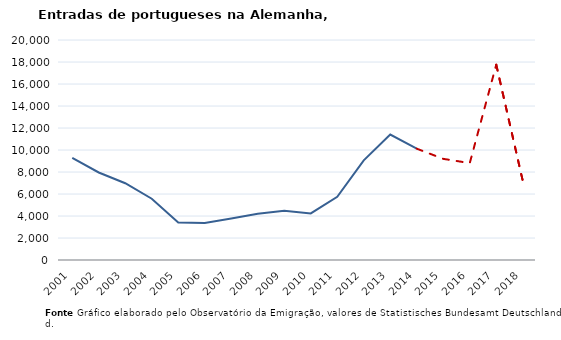
| Category | Entradas |
|---|---|
| 2001.0 | 9287 |
| 2002.0 | 7955 |
| 2003.0 | 6981 |
| 2004.0 | 5570 |
| 2005.0 | 3418 |
| 2006.0 | 3371 |
| 2007.0 | 3766 |
| 2008.0 | 4214 |
| 2009.0 | 4468 |
| 2010.0 | 4238 |
| 2011.0 | 5752 |
| 2012.0 | 9054 |
| 2013.0 | 11401 |
| 2014.0 | 10121 |
| 2015.0 | 9195 |
| 2016.0 | 8810 |
| 2017.0 | 17750 |
| 2018.0 | 7200 |